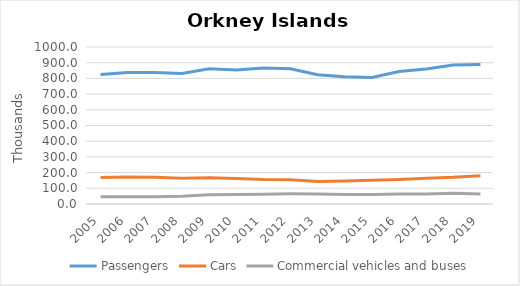
| Category | Passengers | Cars | Commercial vehicles and buses |
|---|---|---|---|
| 2005.0 | 824.758 | 169.292 | 46.596 |
| 2006.0 | 837.5 | 172 | 46.2 |
| 2007.0 | 838.08 | 170.8 | 45.6 |
| 2008.0 | 831.1 | 163.7 | 49.8 |
| 2009.0 | 861.668 | 167.142 | 58.79 |
| 2010.0 | 854.2 | 162.9 | 61.2 |
| 2011.0 | 866.12 | 156.36 | 62.32 |
| 2012.0 | 861.2 | 155.1 | 64.68 |
| 2013.0 | 822.864 | 143.3 | 63.297 |
| 2014.0 | 810.014 | 146.7 | 60.124 |
| 2015.0 | 805.986 | 150.5 | 60.316 |
| 2016.0 | 843.591 | 156.1 | 63.711 |
| 2017.0 | 860.173 | 164.125 | 63.483 |
| 2018.0 | 884.855 | 170.218 | 68.571 |
| 2019.0 | 889.091 | 180.297 | 63.188 |